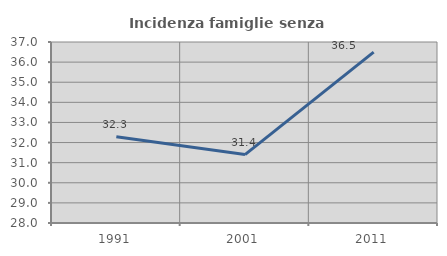
| Category | Incidenza famiglie senza nuclei |
|---|---|
| 1991.0 | 32.292 |
| 2001.0 | 31.404 |
| 2011.0 | 36.493 |